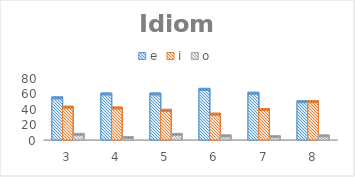
| Category | e | i | o |
|---|---|---|---|
| 3.0 | 53 | 41 | 6 |
| 4.0 | 58 | 40 | 2 |
| 5.0 | 58 | 37 | 6 |
| 6.0 | 64 | 32 | 4 |
| 7.0 | 59 | 38 | 3 |
| 8.0 | 48 | 48 | 4 |